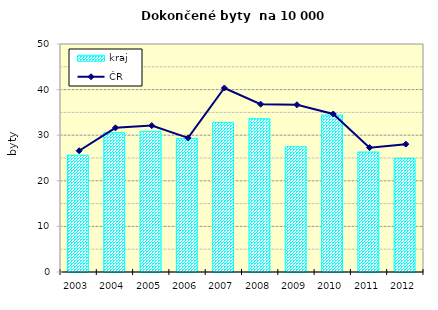
| Category | kraj |
|---|---|
| 2003.0 | 25.6 |
| 2004.0 | 30.564 |
| 2005.0 | 30.843 |
| 2006.0 | 29.25 |
| 2007.0 | 32.796 |
| 2008.0 | 33.613 |
| 2009.0 | 27.478 |
| 2010.0 | 34.421 |
| 2011.0 | 26.31 |
| 2012.0 | 24.94 |